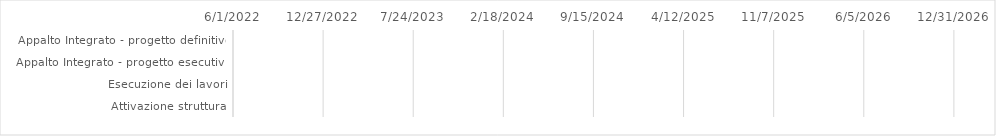
| Category | inizio | durata (gg) | fine |
|---|---|---|---|
| Appalto Integrato - progetto definitivo | 0 | 0 | 0 |
| Appalto Integrato - progetto esecutivo | 0 | 0 | 0 |
| Esecuzione dei lavori | 0 | 0 | 0 |
| Attivazione struttura | 0 | 0 | 0 |